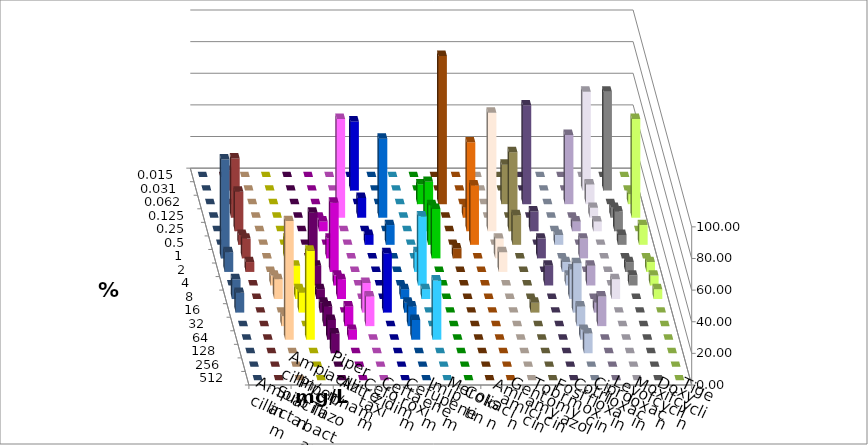
| Category | Ampicillin | Ampicillin/ Sulbactam | Piperacillin | Piperacillin/ Tazobactam | Aztreonam | Cefotaxim | Ceftazidim | Cefuroxim | Imipenem | Meropenem | Colistin | Amikacin | Gentamicin | Tobramycin | Fosfomycin | Cotrimoxazol | Ciprofloxacin | Levofloxacin | Moxifloxacin | Doxycyclin | Tigecyclin |
|---|---|---|---|---|---|---|---|---|---|---|---|---|---|---|---|---|---|---|---|---|---|
| 0.015 | 0 | 0 | 0 | 0 | 0 | 0 | 0 | 0 | 0 | 0 | 0 | 0 | 0 | 0 | 0 | 0 | 0 | 0 | 0 | 0 | 0 |
| 0.031 | 0 | 0 | 0 | 0 | 0 | 43.75 | 0 | 0 | 0 | 0 | 0 | 0 | 0 | 0 | 0 | 0 | 62.5 | 62.5 | 0 | 0 | 12.5 |
| 0.062 | 0 | 0 | 0 | 0 | 0 | 0 | 0 | 0 | 12.5 | 93.75 | 0 | 0 | 25 | 62.5 | 0 | 43.75 | 12.5 | 0 | 6.25 | 0 | 0 |
| 0.125 | 0 | 0 | 0 | 0 | 62.5 | 12.5 | 50 | 0 | 0 | 0 | 6.25 | 0 | 0 | 0 | 0 | 0 | 6.25 | 6.25 | 62.5 | 0 | 37.5 |
| 0.25 | 0 | 0 | 0 | 6.25 | 0 | 0 | 0 | 0 | 31.25 | 0 | 56.25 | 75 | 50 | 12.5 | 0 | 6.25 | 6.25 | 12.5 | 0 | 0 | 25 |
| 0.5 | 0 | 0 | 0 | 0 | 0 | 6.25 | 12.5 | 0 | 25 | 0 | 37.5 | 0 | 18.75 | 0 | 6.25 | 0 | 0 | 6.25 | 12.5 | 0 | 6.25 |
| 1.0 | 0 | 12.5 | 0 | 12.5 | 0 | 0 | 0 | 0 | 31.25 | 6.25 | 0 | 12.5 | 0 | 12.5 | 0 | 12.5 | 0 | 0 | 0 | 62.5 | 12.5 |
| 2.0 | 0 | 0 | 37.5 | 43.75 | 0 | 0 | 0 | 12.5 | 0 | 0 | 0 | 12.5 | 0 | 0 | 6.25 | 0 | 0 | 6.25 | 6.25 | 12.5 | 6.25 |
| 4.0 | 6.25 | 12.5 | 12.5 | 6.25 | 0 | 0 | 0 | 43.75 | 0 | 0 | 0 | 0 | 0 | 12.5 | 6.25 | 12.5 | 0 | 6.25 | 6.25 | 0 | 0 |
| 8.0 | 12.5 | 6.25 | 6.25 | 12.5 | 0 | 0 | 6.25 | 6.25 | 0 | 0 | 0 | 0 | 0 | 0 | 18.75 | 0 | 12.5 | 0 | 6.25 | 12.5 | 0 |
| 16.0 | 0 | 12.5 | 6.25 | 0 | 18.75 | 37.5 | 6.25 | 0 | 0 | 0 | 0 | 0 | 6.25 | 0 | 31.25 | 6.25 | 0 | 0 | 0 | 12.5 | 0 |
| 32.0 | 6.25 | 0 | 12.5 | 12.5 | 18.75 | 0 | 12.5 | 0 | 0 | 0 | 0 | 0 | 0 | 0 | 12.5 | 18.75 | 0 | 0 | 0 | 0 | 0 |
| 64.0 | 75 | 56.25 | 12.5 | 6.25 | 0 | 0 | 12.5 | 37.5 | 0 | 0 | 0 | 0 | 0 | 0 | 6.25 | 0 | 0 | 0 | 0 | 0 | 0 |
| 128.0 | 0 | 0 | 12.5 | 0 | 0 | 0 | 0 | 0 | 0 | 0 | 0 | 0 | 0 | 0 | 12.5 | 0 | 0 | 0 | 0 | 0 | 0 |
| 256.0 | 0 | 0 | 0 | 0 | 0 | 0 | 0 | 0 | 0 | 0 | 0 | 0 | 0 | 0 | 0 | 0 | 0 | 0 | 0 | 0 | 0 |
| 512.0 | 0 | 0 | 0 | 0 | 0 | 0 | 0 | 0 | 0 | 0 | 0 | 0 | 0 | 0 | 0 | 0 | 0 | 0 | 0 | 0 | 0 |